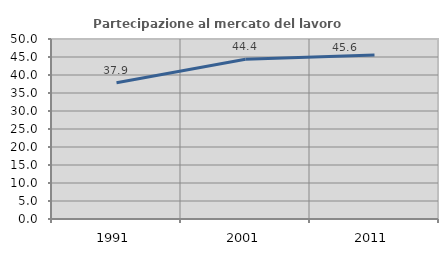
| Category | Partecipazione al mercato del lavoro  femminile |
|---|---|
| 1991.0 | 37.869 |
| 2001.0 | 44.395 |
| 2011.0 | 45.588 |